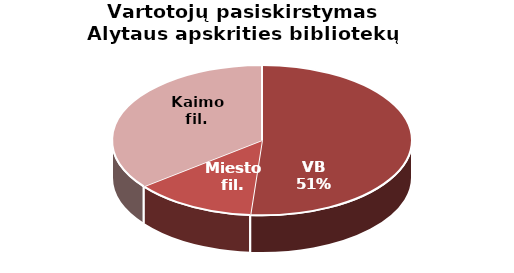
| Category | Vartotojų pasiskirstymas Alytaus apskrities bibliotekų padaliniuose |
|---|---|
| VB | 21383 |
| Miesto fil. | 5507 |
| Kaimo fil. | 14837 |